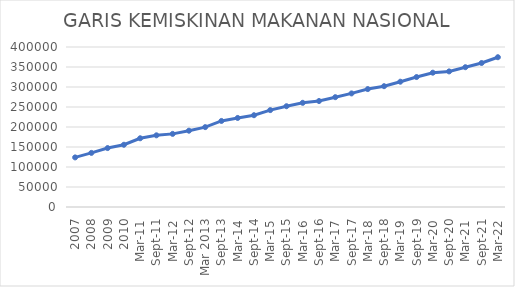
| Category | GARIS KEMISKINAN MAKANAN NASIONAL |
|---|---|
| 2007 | 123993 |
| 2008 | 135270 |
| 2009 | 147339 |
| 2010 | 155615 |
| Mar-11 | 171834 |
| Sep-11 | 179204 |
| Mar-12 | 182796 |
| Sep-12 | 190758 |
| Mar 2013 | 199691 |
| Sep-13 | 215122 |
| Mar-14 | 222628 |
| Sep-14 | 229469 |
| Mar-15 | 242241 |
| Sep-15 | 251943 |
| Mar-16 | 260469 |
| Sep-16 | 264941 |
| Mar-17 | 274544.38 |
| Sep-17 | 283964 |
| Mar-18 | 294806 |
| Sep-18 | 302022.07 |
| Mar-19 | 313232 |
| Sep-19 | 324911 |
| Mar-20 | 335793 |
| Sep-20 | 339003 |
| Mar-21 | 349474 |
| Sep-21 | 360007 |
| Mar-22 | 374455 |